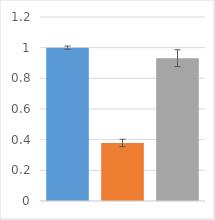
| Category | 1 |
|---|---|
|  | 1 |
|  | 0.379 |
|  | 0.931 |